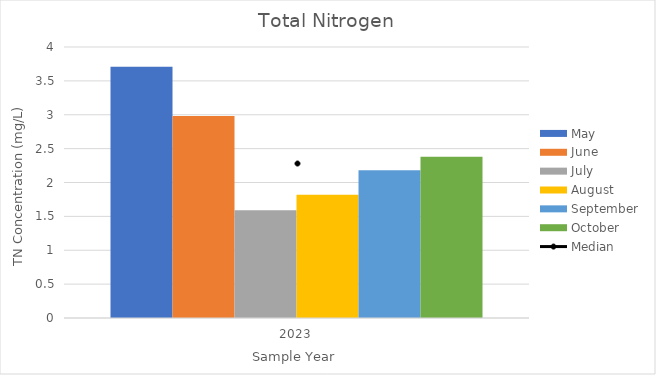
| Category | May | June | July | August | September | October |
|---|---|---|---|---|---|---|
| 2023.0 | 3.71 | 2.98 | 1.59 | 1.82 | 2.18 | 2.38 |